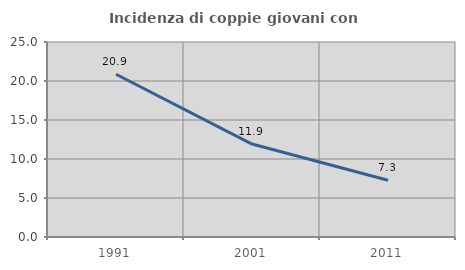
| Category | Incidenza di coppie giovani con figli |
|---|---|
| 1991.0 | 20.863 |
| 2001.0 | 11.917 |
| 2011.0 | 7.277 |